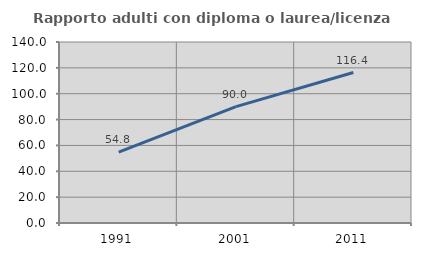
| Category | Rapporto adulti con diploma o laurea/licenza media  |
|---|---|
| 1991.0 | 54.788 |
| 2001.0 | 90.023 |
| 2011.0 | 116.367 |